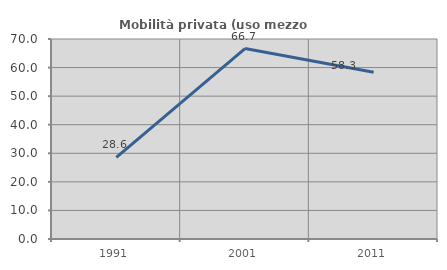
| Category | Mobilità privata (uso mezzo privato) |
|---|---|
| 1991.0 | 28.571 |
| 2001.0 | 66.667 |
| 2011.0 | 58.333 |